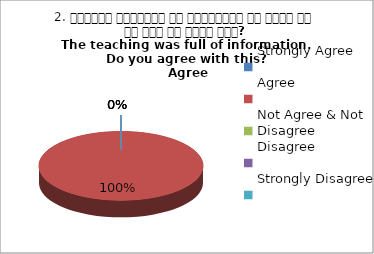
| Category | 2. शिक्षण जानकारी से परिपूर्ण था क्या आप इस बात से सहमत हैं?
The teaching was full of information. Do you agree with this?
 Agree |
|---|---|
| Strongly Agree | 0 |
| Agree | 1 |
| Not Agree & Not Disagree | 0 |
| Disagree | 0 |
| Strongly Disagree | 0 |